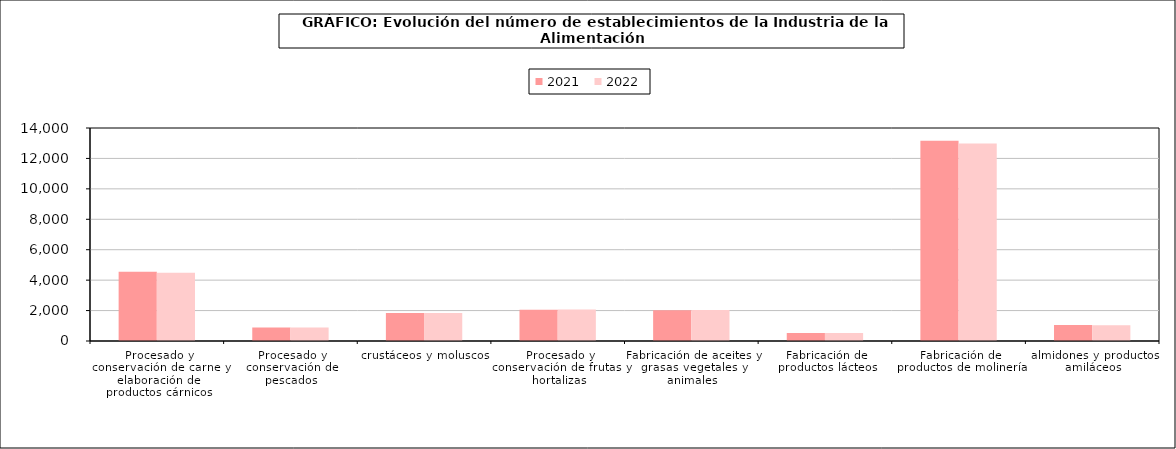
| Category | 2021 | 2022 |
|---|---|---|
| 0 | 4550 | 4490 |
| 1 | 885 | 894 |
| 2 | 1843 | 1846 |
| 3 | 2056 | 2071 |
| 4 | 2015 | 2032 |
| 5 | 522 | 521 |
| 6 | 13157 | 12987 |
| 7 | 1047 | 1038 |